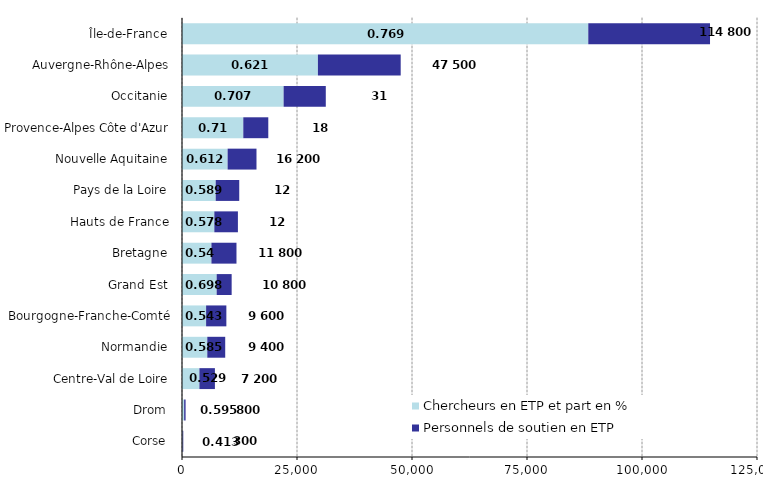
| Category | Chercheurs en ETP et part en % | Personnels de soutien en ETP |
|---|---|---|
| Corse | 114.2 | 162.4 |
| Drom | 465.1 | 316.2 |
| Centre-Val de Loire | 3783.9 | 3371.2 |
| Normandie | 5496.3 | 3898.9 |
| Bourgogne-Franche-Comté | 5240.5 | 4402.7 |
| Grand Est | 7536.4 | 3258 |
| Bretagne | 6396.6 | 5448.1 |
| Hauts de France | 7026.5 | 5126.8 |
| Pays de la Loire | 7325.3 | 5119.9 |
| Nouvelle Aquitaine | 9917.2 | 6277.5 |
| Provence-Alpes Côte d'Azur | 13323.3 | 5436.2 |
| Occitanie | 22091 | 9167.7 |
| Auvergne-Rhône-Alpes | 29547.7 | 17995.8 |
| Île-de-France | 88319.9 | 26467.6 |